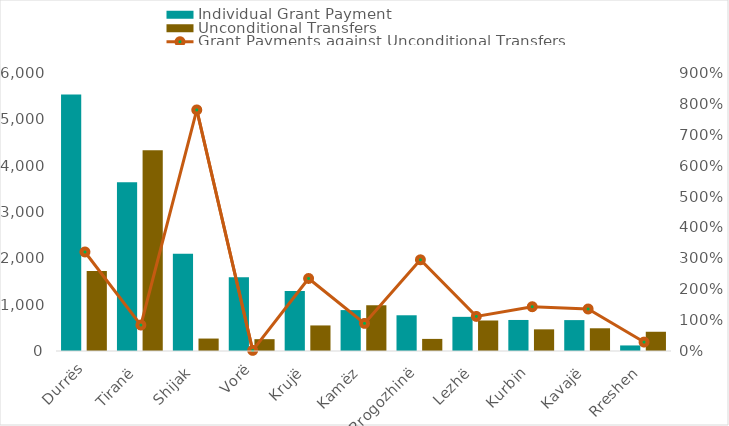
| Category | Individual Grant Payment | Unconditional Transfers |
|---|---|---|
| Durrës | 5534.132 | 1726.216 |
| Tiranë | 3642.007 | 4333.589 |
| Shijak | 2097.161 | 268.71 |
| Vorë | 1589.576 | 255.222 |
| Krujë | 1295.092 | 551.602 |
| Kamëz | 883.044 | 988.331 |
| Rrogozhinë | 771.097 | 261.157 |
| Lezhë | 737.191 | 658.557 |
| Kurbin | 669.767 | 467.393 |
| Kavajë | 666.938 | 490.366 |
| Rreshen | 119.963 | 415.344 |